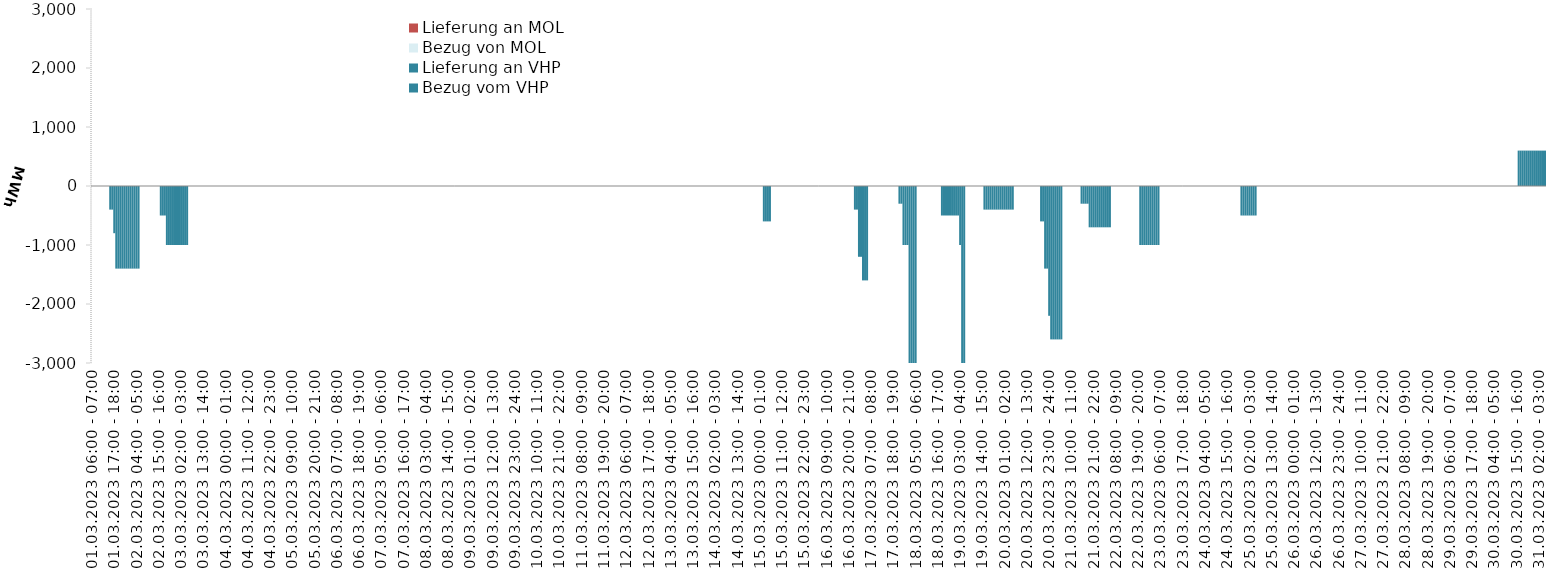
| Category | Bezug vom VHP | Lieferung an VHP | Bezug von MOL | Lieferung an MOL |
|---|---|---|---|---|
| 01.03.2023 06:00 - 07:00 | 0 | 0 | 0 | 0 |
| 01.03.2023 07:00 - 08:00 | 0 | 0 | 0 | 0 |
| 01.03.2023 08:00 - 09:00 | 0 | 0 | 0 | 0 |
| 01.03.2023 09:00 - 10:00 | 0 | 0 | 0 | 0 |
| 01.03.2023 10:00 - 11:00 | 0 | 0 | 0 | 0 |
| 01.03.2023 11:00 - 12:00 | 0 | 0 | 0 | 0 |
| 01.03.2023 12:00 - 13:00 | 0 | 0 | 0 | 0 |
| 01.03.2023 13:00 - 14:00 | 0 | 0 | 0 | 0 |
| 01.03.2023 14:00 - 15:00 | 0 | 0 | 0 | 0 |
| 01.03.2023 15:00 - 16:00 | 0 | -400 | 0 | 0 |
| 01.03.2023 16:00 - 17:00 | 0 | -400 | 0 | 0 |
| 01.03.2023 17:00 - 18:00 | 0 | -800 | 0 | 0 |
| 01.03.2023 18:00 - 19:00 | 0 | -1400 | 0 | 0 |
| 01.03.2023 19:00 - 20:00 | 0 | -1400 | 0 | 0 |
| 01.03.2023 20:00 - 21:00 | 0 | -1400 | 0 | 0 |
| 01.03.2023 21:00 - 22:00 | 0 | -1400 | 0 | 0 |
| 01.03.2023 22:00 - 23:00 | 0 | -1400 | 0 | 0 |
| 01.03.2023 23:00 - 24:00 | 0 | -1400 | 0 | 0 |
| 02.03.2023 00:00 - 01:00 | 0 | -1400 | 0 | 0 |
| 02.03.2023 01:00 - 02:00 | 0 | -1400 | 0 | 0 |
| 02.03.2023 02:00 - 03:00 | 0 | -1400 | 0 | 0 |
| 02.03.2023 03:00 - 04:00 | 0 | -1400 | 0 | 0 |
| 02.03.2023 04:00 - 05:00 | 0 | -1400 | 0 | 0 |
| 02.03.2023 05:00 - 06:00 | 0 | -1400 | 0 | 0 |
| 02.03.2023 06:00 - 07:00 | 0 | 0 | 0 | 0 |
| 02.03.2023 07:00 - 08:00 | 0 | 0 | 0 | 0 |
| 02.03.2023 08:00 - 09:00 | 0 | 0 | 0 | 0 |
| 02.03.2023 09:00 - 10:00 | 0 | 0 | 0 | 0 |
| 02.03.2023 10:00 - 11:00 | 0 | 0 | 0 | 0 |
| 02.03.2023 11:00 - 12:00 | 0 | 0 | 0 | 0 |
| 02.03.2023 12:00 - 13:00 | 0 | 0 | 0 | 0 |
| 02.03.2023 13:00 - 14:00 | 0 | 0 | 0 | 0 |
| 02.03.2023 14:00 - 15:00 | 0 | 0 | 0 | 0 |
| 02.03.2023 15:00 - 16:00 | 0 | 0 | 0 | 0 |
| 02.03.2023 16:00 - 17:00 | 0 | -500 | 0 | 0 |
| 02.03.2023 17:00 - 18:00 | 0 | -500 | 0 | 0 |
| 02.03.2023 18:00 - 19:00 | 0 | -500 | 0 | 0 |
| 02.03.2023 19:00 - 20:00 | 0 | -1000 | 0 | 0 |
| 02.03.2023 20:00 - 21:00 | 0 | -1000 | 0 | 0 |
| 02.03.2023 21:00 - 22:00 | 0 | -1000 | 0 | 0 |
| 02.03.2023 22:00 - 23:00 | 0 | -1000 | 0 | 0 |
| 02.03.2023 23:00 - 24:00 | 0 | -1000 | 0 | 0 |
| 03.03.2023 00:00 - 01:00 | 0 | -1000 | 0 | 0 |
| 03.03.2023 01:00 - 02:00 | 0 | -1000 | 0 | 0 |
| 03.03.2023 02:00 - 03:00 | 0 | -1000 | 0 | 0 |
| 03.03.2023 03:00 - 04:00 | 0 | -1000 | 0 | 0 |
| 03.03.2023 04:00 - 05:00 | 0 | -1000 | 0 | 0 |
| 03.03.2023 05:00 - 06:00 | 0 | -1000 | 0 | 0 |
| 03.03.2023 06:00 - 07:00 | 0 | 0 | 0 | 0 |
| 03.03.2023 07:00 - 08:00 | 0 | 0 | 0 | 0 |
| 03.03.2023 08:00 - 09:00 | 0 | 0 | 0 | 0 |
| 03.03.2023 09:00 - 10:00 | 0 | 0 | 0 | 0 |
| 03.03.2023 10:00 - 11:00 | 0 | 0 | 0 | 0 |
| 03.03.2023 11:00 - 12:00 | 0 | 0 | 0 | 0 |
| 03.03.2023 12:00 - 13:00 | 0 | 0 | 0 | 0 |
| 03.03.2023 13:00 - 14:00 | 0 | 0 | 0 | 0 |
| 03.03.2023 14:00 - 15:00 | 0 | 0 | 0 | 0 |
| 03.03.2023 15:00 - 16:00 | 0 | 0 | 0 | 0 |
| 03.03.2023 16:00 - 17:00 | 0 | 0 | 0 | 0 |
| 03.03.2023 17:00 - 18:00 | 0 | 0 | 0 | 0 |
| 03.03.2023 18:00 - 19:00 | 0 | 0 | 0 | 0 |
| 03.03.2023 19:00 - 20:00 | 0 | 0 | 0 | 0 |
| 03.03.2023 20:00 - 21:00 | 0 | 0 | 0 | 0 |
| 03.03.2023 21:00 - 22:00 | 0 | 0 | 0 | 0 |
| 03.03.2023 22:00 - 23:00 | 0 | 0 | 0 | 0 |
| 03.03.2023 23:00 - 24:00 | 0 | 0 | 0 | 0 |
| 04.03.2023 00:00 - 01:00 | 0 | 0 | 0 | 0 |
| 04.03.2023 01:00 - 02:00 | 0 | 0 | 0 | 0 |
| 04.03.2023 02:00 - 03:00 | 0 | 0 | 0 | 0 |
| 04.03.2023 03:00 - 04:00 | 0 | 0 | 0 | 0 |
| 04.03.2023 04:00 - 05:00 | 0 | 0 | 0 | 0 |
| 04.03.2023 05:00 - 06:00 | 0 | 0 | 0 | 0 |
| 04.03.2023 06:00 - 07:00 | 0 | 0 | 0 | 0 |
| 04.03.2023 07:00 - 08:00 | 0 | 0 | 0 | 0 |
| 04.03.2023 08:00 - 09:00 | 0 | 0 | 0 | 0 |
| 04.03.2023 09:00 - 10:00 | 0 | 0 | 0 | 0 |
| 04.03.2023 10:00 - 11:00 | 0 | 0 | 0 | 0 |
| 04.03.2023 11:00 - 12:00 | 0 | 0 | 0 | 0 |
| 04.03.2023 12:00 - 13:00 | 0 | 0 | 0 | 0 |
| 04.03.2023 13:00 - 14:00 | 0 | 0 | 0 | 0 |
| 04.03.2023 14:00 - 15:00 | 0 | 0 | 0 | 0 |
| 04.03.2023 15:00 - 16:00 | 0 | 0 | 0 | 0 |
| 04.03.2023 16:00 - 17:00 | 0 | 0 | 0 | 0 |
| 04.03.2023 17:00 - 18:00 | 0 | 0 | 0 | 0 |
| 04.03.2023 18:00 - 19:00 | 0 | 0 | 0 | 0 |
| 04.03.2023 19:00 - 20:00 | 0 | 0 | 0 | 0 |
| 04.03.2023 20:00 - 21:00 | 0 | 0 | 0 | 0 |
| 04.03.2023 21:00 - 22:00 | 0 | 0 | 0 | 0 |
| 04.03.2023 22:00 - 23:00 | 0 | 0 | 0 | 0 |
| 04.03.2023 23:00 - 24:00 | 0 | 0 | 0 | 0 |
| 05.03.2023 00:00 - 01:00 | 0 | 0 | 0 | 0 |
| 05.03.2023 01:00 - 02:00 | 0 | 0 | 0 | 0 |
| 05.03.2023 02:00 - 03:00 | 0 | 0 | 0 | 0 |
| 05.03.2023 03:00 - 04:00 | 0 | 0 | 0 | 0 |
| 05.03.2023 04:00 - 05:00 | 0 | 0 | 0 | 0 |
| 05.03.2023 05:00 - 06:00 | 0 | 0 | 0 | 0 |
| 05.03.2023 06:00 - 07:00 | 0 | 0 | 0 | 0 |
| 05.03.2023 07:00 - 08:00 | 0 | 0 | 0 | 0 |
| 05.03.2023 08:00 - 09:00 | 0 | 0 | 0 | 0 |
| 05.03.2023 09:00 - 10:00 | 0 | 0 | 0 | 0 |
| 05.03.2023 10:00 - 11:00 | 0 | 0 | 0 | 0 |
| 05.03.2023 11:00 - 12:00 | 0 | 0 | 0 | 0 |
| 05.03.2023 12:00 - 13:00 | 0 | 0 | 0 | 0 |
| 05.03.2023 13:00 - 14:00 | 0 | 0 | 0 | 0 |
| 05.03.2023 14:00 - 15:00 | 0 | 0 | 0 | 0 |
| 05.03.2023 15:00 - 16:00 | 0 | 0 | 0 | 0 |
| 05.03.2023 16:00 - 17:00 | 0 | 0 | 0 | 0 |
| 05.03.2023 17:00 - 18:00 | 0 | 0 | 0 | 0 |
| 05.03.2023 18:00 - 19:00 | 0 | 0 | 0 | 0 |
| 05.03.2023 19:00 - 20:00 | 0 | 0 | 0 | 0 |
| 05.03.2023 20:00 - 21:00 | 0 | 0 | 0 | 0 |
| 05.03.2023 21:00 - 22:00 | 0 | 0 | 0 | 0 |
| 05.03.2023 22:00 - 23:00 | 0 | 0 | 0 | 0 |
| 05.03.2023 23:00 - 24:00 | 0 | 0 | 0 | 0 |
| 06.03.2023 00:00 - 01:00 | 0 | 0 | 0 | 0 |
| 06.03.2023 01:00 - 02:00 | 0 | 0 | 0 | 0 |
| 06.03.2023 02:00 - 03:00 | 0 | 0 | 0 | 0 |
| 06.03.2023 03:00 - 04:00 | 0 | 0 | 0 | 0 |
| 06.03.2023 04:00 - 05:00 | 0 | 0 | 0 | 0 |
| 06.03.2023 05:00 - 06:00 | 0 | 0 | 0 | 0 |
| 06.03.2023 06:00 - 07:00 | 0 | 0 | 0 | 0 |
| 06.03.2023 07:00 - 08:00 | 0 | 0 | 0 | 0 |
| 06.03.2023 08:00 - 09:00 | 0 | 0 | 0 | 0 |
| 06.03.2023 09:00 - 10:00 | 0 | 0 | 0 | 0 |
| 06.03.2023 10:00 - 11:00 | 0 | 0 | 0 | 0 |
| 06.03.2023 11:00 - 12:00 | 0 | 0 | 0 | 0 |
| 06.03.2023 12:00 - 13:00 | 0 | 0 | 0 | 0 |
| 06.03.2023 13:00 - 14:00 | 0 | 0 | 0 | 0 |
| 06.03.2023 14:00 - 15:00 | 0 | 0 | 0 | 0 |
| 06.03.2023 15:00 - 16:00 | 0 | 0 | 0 | 0 |
| 06.03.2023 16:00 - 17:00 | 0 | 0 | 0 | 0 |
| 06.03.2023 17:00 - 18:00 | 0 | 0 | 0 | 0 |
| 06.03.2023 18:00 - 19:00 | 0 | 0 | 0 | 0 |
| 06.03.2023 19:00 - 20:00 | 0 | 0 | 0 | 0 |
| 06.03.2023 20:00 - 21:00 | 0 | 0 | 0 | 0 |
| 06.03.2023 21:00 - 22:00 | 0 | 0 | 0 | 0 |
| 06.03.2023 22:00 - 23:00 | 0 | 0 | 0 | 0 |
| 06.03.2023 23:00 - 24:00 | 0 | 0 | 0 | 0 |
| 07.03.2023 00:00 - 01:00 | 0 | 0 | 0 | 0 |
| 07.03.2023 01:00 - 02:00 | 0 | 0 | 0 | 0 |
| 07.03.2023 02:00 - 03:00 | 0 | 0 | 0 | 0 |
| 07.03.2023 03:00 - 04:00 | 0 | 0 | 0 | 0 |
| 07.03.2023 04:00 - 05:00 | 0 | 0 | 0 | 0 |
| 07.03.2023 05:00 - 06:00 | 0 | 0 | 0 | 0 |
| 07.03.2023 06:00 - 07:00 | 0 | 0 | 0 | 0 |
| 07.03.2023 07:00 - 08:00 | 0 | 0 | 0 | 0 |
| 07.03.2023 08:00 - 09:00 | 0 | 0 | 0 | 0 |
| 07.03.2023 09:00 - 10:00 | 0 | 0 | 0 | 0 |
| 07.03.2023 10:00 - 11:00 | 0 | 0 | 0 | 0 |
| 07.03.2023 11:00 - 12:00 | 0 | 0 | 0 | 0 |
| 07.03.2023 12:00 - 13:00 | 0 | 0 | 0 | 0 |
| 07.03.2023 13:00 - 14:00 | 0 | 0 | 0 | 0 |
| 07.03.2023 14:00 - 15:00 | 0 | 0 | 0 | 0 |
| 07.03.2023 15:00 - 16:00 | 0 | 0 | 0 | 0 |
| 07.03.2023 16:00 - 17:00 | 0 | 0 | 0 | 0 |
| 07.03.2023 17:00 - 18:00 | 0 | 0 | 0 | 0 |
| 07.03.2023 18:00 - 19:00 | 0 | 0 | 0 | 0 |
| 07.03.2023 19:00 - 20:00 | 0 | 0 | 0 | 0 |
| 07.03.2023 20:00 - 21:00 | 0 | 0 | 0 | 0 |
| 07.03.2023 21:00 - 22:00 | 0 | 0 | 0 | 0 |
| 07.03.2023 22:00 - 23:00 | 0 | 0 | 0 | 0 |
| 07.03.2023 23:00 - 24:00 | 0 | 0 | 0 | 0 |
| 08.03.2023 00:00 - 01:00 | 0 | 0 | 0 | 0 |
| 08.03.2023 01:00 - 02:00 | 0 | 0 | 0 | 0 |
| 08.03.2023 02:00 - 03:00 | 0 | 0 | 0 | 0 |
| 08.03.2023 03:00 - 04:00 | 0 | 0 | 0 | 0 |
| 08.03.2023 04:00 - 05:00 | 0 | 0 | 0 | 0 |
| 08.03.2023 05:00 - 06:00 | 0 | 0 | 0 | 0 |
| 08.03.2023 06:00 - 07:00 | 0 | 0 | 0 | 0 |
| 08.03.2023 07:00 - 08:00 | 0 | 0 | 0 | 0 |
| 08.03.2023 08:00 - 09:00 | 0 | 0 | 0 | 0 |
| 08.03.2023 09:00 - 10:00 | 0 | 0 | 0 | 0 |
| 08.03.2023 10:00 - 11:00 | 0 | 0 | 0 | 0 |
| 08.03.2023 11:00 - 12:00 | 0 | 0 | 0 | 0 |
| 08.03.2023 12:00 - 13:00 | 0 | 0 | 0 | 0 |
| 08.03.2023 13:00 - 14:00 | 0 | 0 | 0 | 0 |
| 08.03.2023 14:00 - 15:00 | 0 | 0 | 0 | 0 |
| 08.03.2023 15:00 - 16:00 | 0 | 0 | 0 | 0 |
| 08.03.2023 16:00 - 17:00 | 0 | 0 | 0 | 0 |
| 08.03.2023 17:00 - 18:00 | 0 | 0 | 0 | 0 |
| 08.03.2023 18:00 - 19:00 | 0 | 0 | 0 | 0 |
| 08.03.2023 19:00 - 20:00 | 0 | 0 | 0 | 0 |
| 08.03.2023 20:00 - 21:00 | 0 | 0 | 0 | 0 |
| 08.03.2023 21:00 - 22:00 | 0 | 0 | 0 | 0 |
| 08.03.2023 22:00 - 23:00 | 0 | 0 | 0 | 0 |
| 08.03.2023 23:00 - 24:00 | 0 | 0 | 0 | 0 |
| 09.03.2023 00:00 - 01:00 | 0 | 0 | 0 | 0 |
| 09.03.2023 01:00 - 02:00 | 0 | 0 | 0 | 0 |
| 09.03.2023 02:00 - 03:00 | 0 | 0 | 0 | 0 |
| 09.03.2023 03:00 - 04:00 | 0 | 0 | 0 | 0 |
| 09.03.2023 04:00 - 05:00 | 0 | 0 | 0 | 0 |
| 09.03.2023 05:00 - 06:00 | 0 | 0 | 0 | 0 |
| 09.03.2023 06:00 - 07:00 | 0 | 0 | 0 | 0 |
| 09.03.2023 07:00 - 08:00 | 0 | 0 | 0 | 0 |
| 09.03.2023 08:00 - 09:00 | 0 | 0 | 0 | 0 |
| 09.03.2023 09:00 - 10:00 | 0 | 0 | 0 | 0 |
| 09.03.2023 10:00 - 11:00 | 0 | 0 | 0 | 0 |
| 09.03.2023 11:00 - 12:00 | 0 | 0 | 0 | 0 |
| 09.03.2023 12:00 - 13:00 | 0 | 0 | 0 | 0 |
| 09.03.2023 13:00 - 14:00 | 0 | 0 | 0 | 0 |
| 09.03.2023 14:00 - 15:00 | 0 | 0 | 0 | 0 |
| 09.03.2023 15:00 - 16:00 | 0 | 0 | 0 | 0 |
| 09.03.2023 16:00 - 17:00 | 0 | 0 | 0 | 0 |
| 09.03.2023 17:00 - 18:00 | 0 | 0 | 0 | 0 |
| 09.03.2023 18:00 - 19:00 | 0 | 0 | 0 | 0 |
| 09.03.2023 19:00 - 20:00 | 0 | 0 | 0 | 0 |
| 09.03.2023 20:00 - 21:00 | 0 | 0 | 0 | 0 |
| 09.03.2023 21:00 - 22:00 | 0 | 0 | 0 | 0 |
| 09.03.2023 22:00 - 23:00 | 0 | 0 | 0 | 0 |
| 09.03.2023 23:00 - 24:00 | 0 | 0 | 0 | 0 |
| 10.03.2023 00:00 - 01:00 | 0 | 0 | 0 | 0 |
| 10.03.2023 01:00 - 02:00 | 0 | 0 | 0 | 0 |
| 10.03.2023 02:00 - 03:00 | 0 | 0 | 0 | 0 |
| 10.03.2023 03:00 - 04:00 | 0 | 0 | 0 | 0 |
| 10.03.2023 04:00 - 05:00 | 0 | 0 | 0 | 0 |
| 10.03.2023 05:00 - 06:00 | 0 | 0 | 0 | 0 |
| 10.03.2023 06:00 - 07:00 | 0 | 0 | 0 | 0 |
| 10.03.2023 07:00 - 08:00 | 0 | 0 | 0 | 0 |
| 10.03.2023 08:00 - 09:00 | 0 | 0 | 0 | 0 |
| 10.03.2023 09:00 - 10:00 | 0 | 0 | 0 | 0 |
| 10.03.2023 10:00 - 11:00 | 0 | 0 | 0 | 0 |
| 10.03.2023 11:00 - 12:00 | 0 | 0 | 0 | 0 |
| 10.03.2023 12:00 - 13:00 | 0 | 0 | 0 | 0 |
| 10.03.2023 13:00 - 14:00 | 0 | 0 | 0 | 0 |
| 10.03.2023 14:00 - 15:00 | 0 | 0 | 0 | 0 |
| 10.03.2023 15:00 - 16:00 | 0 | 0 | 0 | 0 |
| 10.03.2023 16:00 - 17:00 | 0 | 0 | 0 | 0 |
| 10.03.2023 17:00 - 18:00 | 0 | 0 | 0 | 0 |
| 10.03.2023 18:00 - 19:00 | 0 | 0 | 0 | 0 |
| 10.03.2023 19:00 - 20:00 | 0 | 0 | 0 | 0 |
| 10.03.2023 20:00 - 21:00 | 0 | 0 | 0 | 0 |
| 10.03.2023 21:00 - 22:00 | 0 | 0 | 0 | 0 |
| 10.03.2023 22:00 - 23:00 | 0 | 0 | 0 | 0 |
| 10.03.2023 23:00 - 24:00 | 0 | 0 | 0 | 0 |
| 11.03.2023 00:00 - 01:00 | 0 | 0 | 0 | 0 |
| 11.03.2023 01:00 - 02:00 | 0 | 0 | 0 | 0 |
| 11.03.2023 02:00 - 03:00 | 0 | 0 | 0 | 0 |
| 11.03.2023 03:00 - 04:00 | 0 | 0 | 0 | 0 |
| 11.03.2023 04:00 - 05:00 | 0 | 0 | 0 | 0 |
| 11.03.2023 05:00 - 06:00 | 0 | 0 | 0 | 0 |
| 11.03.2023 06:00 - 07:00 | 0 | 0 | 0 | 0 |
| 11.03.2023 07:00 - 08:00 | 0 | 0 | 0 | 0 |
| 11.03.2023 08:00 - 09:00 | 0 | 0 | 0 | 0 |
| 11.03.2023 09:00 - 10:00 | 0 | 0 | 0 | 0 |
| 11.03.2023 10:00 - 11:00 | 0 | 0 | 0 | 0 |
| 11.03.2023 11:00 - 12:00 | 0 | 0 | 0 | 0 |
| 11.03.2023 12:00 - 13:00 | 0 | 0 | 0 | 0 |
| 11.03.2023 13:00 - 14:00 | 0 | 0 | 0 | 0 |
| 11.03.2023 14:00 - 15:00 | 0 | 0 | 0 | 0 |
| 11.03.2023 15:00 - 16:00 | 0 | 0 | 0 | 0 |
| 11.03.2023 16:00 - 17:00 | 0 | 0 | 0 | 0 |
| 11.03.2023 17:00 - 18:00 | 0 | 0 | 0 | 0 |
| 11.03.2023 18:00 - 19:00 | 0 | 0 | 0 | 0 |
| 11.03.2023 19:00 - 20:00 | 0 | 0 | 0 | 0 |
| 11.03.2023 20:00 - 21:00 | 0 | 0 | 0 | 0 |
| 11.03.2023 21:00 - 22:00 | 0 | 0 | 0 | 0 |
| 11.03.2023 22:00 - 23:00 | 0 | 0 | 0 | 0 |
| 11.03.2023 23:00 - 24:00 | 0 | 0 | 0 | 0 |
| 12.03.2023 00:00 - 01:00 | 0 | 0 | 0 | 0 |
| 12.03.2023 01:00 - 02:00 | 0 | 0 | 0 | 0 |
| 12.03.2023 02:00 - 03:00 | 0 | 0 | 0 | 0 |
| 12.03.2023 03:00 - 04:00 | 0 | 0 | 0 | 0 |
| 12.03.2023 04:00 - 05:00 | 0 | 0 | 0 | 0 |
| 12.03.2023 05:00 - 06:00 | 0 | 0 | 0 | 0 |
| 12.03.2023 06:00 - 07:00 | 0 | 0 | 0 | 0 |
| 12.03.2023 07:00 - 08:00 | 0 | 0 | 0 | 0 |
| 12.03.2023 08:00 - 09:00 | 0 | 0 | 0 | 0 |
| 12.03.2023 09:00 - 10:00 | 0 | 0 | 0 | 0 |
| 12.03.2023 10:00 - 11:00 | 0 | 0 | 0 | 0 |
| 12.03.2023 11:00 - 12:00 | 0 | 0 | 0 | 0 |
| 12.03.2023 12:00 - 13:00 | 0 | 0 | 0 | 0 |
| 12.03.2023 13:00 - 14:00 | 0 | 0 | 0 | 0 |
| 12.03.2023 14:00 - 15:00 | 0 | 0 | 0 | 0 |
| 12.03.2023 15:00 - 16:00 | 0 | 0 | 0 | 0 |
| 12.03.2023 16:00 - 17:00 | 0 | 0 | 0 | 0 |
| 12.03.2023 17:00 - 18:00 | 0 | 0 | 0 | 0 |
| 12.03.2023 18:00 - 19:00 | 0 | 0 | 0 | 0 |
| 12.03.2023 19:00 - 20:00 | 0 | 0 | 0 | 0 |
| 12.03.2023 20:00 - 21:00 | 0 | 0 | 0 | 0 |
| 12.03.2023 21:00 - 22:00 | 0 | 0 | 0 | 0 |
| 12.03.2023 22:00 - 23:00 | 0 | 0 | 0 | 0 |
| 12.03.2023 23:00 - 24:00 | 0 | 0 | 0 | 0 |
| 13.03.2023 00:00 - 01:00 | 0 | 0 | 0 | 0 |
| 13.03.2023 01:00 - 02:00 | 0 | 0 | 0 | 0 |
| 13.03.2023 02:00 - 03:00 | 0 | 0 | 0 | 0 |
| 13.03.2023 03:00 - 04:00 | 0 | 0 | 0 | 0 |
| 13.03.2023 04:00 - 05:00 | 0 | 0 | 0 | 0 |
| 13.03.2023 05:00 - 06:00 | 0 | 0 | 0 | 0 |
| 13.03.2023 06:00 - 07:00 | 0 | 0 | 0 | 0 |
| 13.03.2023 07:00 - 08:00 | 0 | 0 | 0 | 0 |
| 13.03.2023 08:00 - 09:00 | 0 | 0 | 0 | 0 |
| 13.03.2023 09:00 - 10:00 | 0 | 0 | 0 | 0 |
| 13.03.2023 10:00 - 11:00 | 0 | 0 | 0 | 0 |
| 13.03.2023 11:00 - 12:00 | 0 | 0 | 0 | 0 |
| 13.03.2023 12:00 - 13:00 | 0 | 0 | 0 | 0 |
| 13.03.2023 13:00 - 14:00 | 0 | 0 | 0 | 0 |
| 13.03.2023 14:00 - 15:00 | 0 | 0 | 0 | 0 |
| 13.03.2023 15:00 - 16:00 | 0 | 0 | 0 | 0 |
| 13.03.2023 16:00 - 17:00 | 0 | 0 | 0 | 0 |
| 13.03.2023 17:00 - 18:00 | 0 | 0 | 0 | 0 |
| 13.03.2023 18:00 - 19:00 | 0 | 0 | 0 | 0 |
| 13.03.2023 19:00 - 20:00 | 0 | 0 | 0 | 0 |
| 13.03.2023 20:00 - 21:00 | 0 | 0 | 0 | 0 |
| 13.03.2023 21:00 - 22:00 | 0 | 0 | 0 | 0 |
| 13.03.2023 22:00 - 23:00 | 0 | 0 | 0 | 0 |
| 13.03.2023 23:00 - 24:00 | 0 | 0 | 0 | 0 |
| 14.03.2023 00:00 - 01:00 | 0 | 0 | 0 | 0 |
| 14.03.2023 01:00 - 02:00 | 0 | 0 | 0 | 0 |
| 14.03.2023 02:00 - 03:00 | 0 | 0 | 0 | 0 |
| 14.03.2023 03:00 - 04:00 | 0 | 0 | 0 | 0 |
| 14.03.2023 04:00 - 05:00 | 0 | 0 | 0 | 0 |
| 14.03.2023 05:00 - 06:00 | 0 | 0 | 0 | 0 |
| 14.03.2023 06:00 - 07:00 | 0 | 0 | 0 | 0 |
| 14.03.2023 07:00 - 08:00 | 0 | 0 | 0 | 0 |
| 14.03.2023 08:00 - 09:00 | 0 | 0 | 0 | 0 |
| 14.03.2023 09:00 - 10:00 | 0 | 0 | 0 | 0 |
| 14.03.2023 10:00 - 11:00 | 0 | 0 | 0 | 0 |
| 14.03.2023 11:00 - 12:00 | 0 | 0 | 0 | 0 |
| 14.03.2023 12:00 - 13:00 | 0 | 0 | 0 | 0 |
| 14.03.2023 13:00 - 14:00 | 0 | 0 | 0 | 0 |
| 14.03.2023 14:00 - 15:00 | 0 | 0 | 0 | 0 |
| 14.03.2023 15:00 - 16:00 | 0 | 0 | 0 | 0 |
| 14.03.2023 16:00 - 17:00 | 0 | 0 | 0 | 0 |
| 14.03.2023 17:00 - 18:00 | 0 | 0 | 0 | 0 |
| 14.03.2023 18:00 - 19:00 | 0 | 0 | 0 | 0 |
| 14.03.2023 19:00 - 20:00 | 0 | 0 | 0 | 0 |
| 14.03.2023 20:00 - 21:00 | 0 | 0 | 0 | 0 |
| 14.03.2023 21:00 - 22:00 | 0 | 0 | 0 | 0 |
| 14.03.2023 22:00 - 23:00 | 0 | 0 | 0 | 0 |
| 14.03.2023 23:00 - 24:00 | 0 | 0 | 0 | 0 |
| 15.03.2023 00:00 - 01:00 | 0 | 0 | 0 | 0 |
| 15.03.2023 01:00 - 02:00 | 0 | 0 | 0 | 0 |
| 15.03.2023 02:00 - 03:00 | 0 | -600 | 0 | 0 |
| 15.03.2023 03:00 - 04:00 | 0 | -600 | 0 | 0 |
| 15.03.2023 04:00 - 05:00 | 0 | -600 | 0 | 0 |
| 15.03.2023 05:00 - 06:00 | 0 | -600 | 0 | 0 |
| 15.03.2023 06:00 - 07:00 | 0 | 0 | 0 | 0 |
| 15.03.2023 07:00 - 08:00 | 0 | 0 | 0 | 0 |
| 15.03.2023 08:00 - 09:00 | 0 | 0 | 0 | 0 |
| 15.03.2023 09:00 - 10:00 | 0 | 0 | 0 | 0 |
| 15.03.2023 10:00 - 11:00 | 0 | 0 | 0 | 0 |
| 15.03.2023 11:00 - 12:00 | 0 | 0 | 0 | 0 |
| 15.03.2023 12:00 - 13:00 | 0 | 0 | 0 | 0 |
| 15.03.2023 13:00 - 14:00 | 0 | 0 | 0 | 0 |
| 15.03.2023 14:00 - 15:00 | 0 | 0 | 0 | 0 |
| 15.03.2023 15:00 - 16:00 | 0 | 0 | 0 | 0 |
| 15.03.2023 16:00 - 17:00 | 0 | 0 | 0 | 0 |
| 15.03.2023 17:00 - 18:00 | 0 | 0 | 0 | 0 |
| 15.03.2023 18:00 - 19:00 | 0 | 0 | 0 | 0 |
| 15.03.2023 19:00 - 20:00 | 0 | 0 | 0 | 0 |
| 15.03.2023 20:00 - 21:00 | 0 | 0 | 0 | 0 |
| 15.03.2023 21:00 - 22:00 | 0 | 0 | 0 | 0 |
| 15.03.2023 22:00 - 23:00 | 0 | 0 | 0 | 0 |
| 15.03.2023 23:00 - 24:00 | 0 | 0 | 0 | 0 |
| 16.03.2023 00:00 - 01:00 | 0 | 0 | 0 | 0 |
| 16.03.2023 01:00 - 02:00 | 0 | 0 | 0 | 0 |
| 16.03.2023 02:00 - 03:00 | 0 | 0 | 0 | 0 |
| 16.03.2023 03:00 - 04:00 | 0 | 0 | 0 | 0 |
| 16.03.2023 04:00 - 05:00 | 0 | 0 | 0 | 0 |
| 16.03.2023 05:00 - 06:00 | 0 | 0 | 0 | 0 |
| 16.03.2023 06:00 - 07:00 | 0 | 0 | 0 | 0 |
| 16.03.2023 07:00 - 08:00 | 0 | 0 | 0 | 0 |
| 16.03.2023 08:00 - 09:00 | 0 | 0 | 0 | 0 |
| 16.03.2023 09:00 - 10:00 | 0 | 0 | 0 | 0 |
| 16.03.2023 10:00 - 11:00 | 0 | 0 | 0 | 0 |
| 16.03.2023 11:00 - 12:00 | 0 | 0 | 0 | 0 |
| 16.03.2023 12:00 - 13:00 | 0 | 0 | 0 | 0 |
| 16.03.2023 13:00 - 14:00 | 0 | 0 | 0 | 0 |
| 16.03.2023 14:00 - 15:00 | 0 | 0 | 0 | 0 |
| 16.03.2023 15:00 - 16:00 | 0 | 0 | 0 | 0 |
| 16.03.2023 16:00 - 17:00 | 0 | 0 | 0 | 0 |
| 16.03.2023 17:00 - 18:00 | 0 | 0 | 0 | 0 |
| 16.03.2023 18:00 - 19:00 | 0 | 0 | 0 | 0 |
| 16.03.2023 19:00 - 20:00 | 0 | 0 | 0 | 0 |
| 16.03.2023 20:00 - 21:00 | 0 | 0 | 0 | 0 |
| 16.03.2023 21:00 - 22:00 | 0 | 0 | 0 | 0 |
| 16.03.2023 22:00 - 23:00 | 0 | 0 | 0 | 0 |
| 16.03.2023 23:00 - 24:00 | 0 | -400 | 0 | 0 |
| 17.03.2023 00:00 - 01:00 | 0 | -400 | 0 | 0 |
| 17.03.2023 01:00 - 02:00 | 0 | -1200 | 0 | 0 |
| 17.03.2023 02:00 - 03:00 | 0 | -1200 | 0 | 0 |
| 17.03.2023 03:00 - 04:00 | 0 | -1600 | 0 | 0 |
| 17.03.2023 04:00 - 05:00 | 0 | -1600 | 0 | 0 |
| 17.03.2023 05:00 - 06:00 | 0 | -1600 | 0 | 0 |
| 17.03.2023 06:00 - 07:00 | 0 | 0 | 0 | 0 |
| 17.03.2023 07:00 - 08:00 | 0 | 0 | 0 | 0 |
| 17.03.2023 08:00 - 09:00 | 0 | 0 | 0 | 0 |
| 17.03.2023 09:00 - 10:00 | 0 | 0 | 0 | 0 |
| 17.03.2023 10:00 - 11:00 | 0 | 0 | 0 | 0 |
| 17.03.2023 11:00 - 12:00 | 0 | 0 | 0 | 0 |
| 17.03.2023 12:00 - 13:00 | 0 | 0 | 0 | 0 |
| 17.03.2023 13:00 - 14:00 | 0 | 0 | 0 | 0 |
| 17.03.2023 14:00 - 15:00 | 0 | 0 | 0 | 0 |
| 17.03.2023 15:00 - 16:00 | 0 | 0 | 0 | 0 |
| 17.03.2023 16:00 - 17:00 | 0 | 0 | 0 | 0 |
| 17.03.2023 17:00 - 18:00 | 0 | 0 | 0 | 0 |
| 17.03.2023 18:00 - 19:00 | 0 | 0 | 0 | 0 |
| 17.03.2023 19:00 - 20:00 | 0 | 0 | 0 | 0 |
| 17.03.2023 20:00 - 21:00 | 0 | 0 | 0 | 0 |
| 17.03.2023 21:00 - 22:00 | 0 | -300 | 0 | 0 |
| 17.03.2023 22:00 - 23:00 | 0 | -300 | 0 | 0 |
| 17.03.2023 23:00 - 24:00 | 0 | -1000 | 0 | 0 |
| 18.03.2023 00:00 - 01:00 | 0 | -1000 | 0 | 0 |
| 18.03.2023 01:00 - 02:00 | 0 | -1000 | 0 | 0 |
| 18.03.2023 02:00 - 03:00 | 0 | -3000 | 0 | 0 |
| 18.03.2023 03:00 - 04:00 | 0 | -3000 | 0 | 0 |
| 18.03.2023 04:00 - 05:00 | 0 | -3000 | 0 | 0 |
| 18.03.2023 05:00 - 06:00 | 0 | -3000 | 0 | 0 |
| 18.03.2023 06:00 - 07:00 | 0 | 0 | 0 | 0 |
| 18.03.2023 07:00 - 08:00 | 0 | 0 | 0 | 0 |
| 18.03.2023 08:00 - 09:00 | 0 | 0 | 0 | 0 |
| 18.03.2023 09:00 - 10:00 | 0 | 0 | 0 | 0 |
| 18.03.2023 10:00 - 11:00 | 0 | 0 | 0 | 0 |
| 18.03.2023 11:00 - 12:00 | 0 | 0 | 0 | 0 |
| 18.03.2023 12:00 - 13:00 | 0 | 0 | 0 | 0 |
| 18.03.2023 13:00 - 14:00 | 0 | 0 | 0 | 0 |
| 18.03.2023 14:00 - 15:00 | 0 | 0 | 0 | 0 |
| 18.03.2023 15:00 - 16:00 | 0 | 0 | 0 | 0 |
| 18.03.2023 16:00 - 17:00 | 0 | 0 | 0 | 0 |
| 18.03.2023 17:00 - 18:00 | 0 | 0 | 0 | 0 |
| 18.03.2023 18:00 - 19:00 | 0 | -500 | 0 | 0 |
| 18.03.2023 19:00 - 20:00 | 0 | -500 | 0 | 0 |
| 18.03.2023 20:00 - 21:00 | 0 | -500 | 0 | 0 |
| 18.03.2023 21:00 - 22:00 | 0 | -500 | 0 | 0 |
| 18.03.2023 22:00 - 23:00 | 0 | -500 | 0 | 0 |
| 18.03.2023 23:00 - 24:00 | 0 | -500 | 0 | 0 |
| 19.03.2023 00:00 - 01:00 | 0 | -500 | 0 | 0 |
| 19.03.2023 01:00 - 02:00 | 0 | -500 | 0 | 0 |
| 19.03.2023 02:00 - 03:00 | 0 | -500 | 0 | 0 |
| 19.03.2023 03:00 - 04:00 | 0 | -1000 | 0 | 0 |
| 19.03.2023 04:00 - 05:00 | 0 | -3000 | 0 | 0 |
| 19.03.2023 05:00 - 06:00 | 0 | -3000 | 0 | 0 |
| 19.03.2023 06:00 - 07:00 | 0 | 0 | 0 | 0 |
| 19.03.2023 07:00 - 08:00 | 0 | 0 | 0 | 0 |
| 19.03.2023 08:00 - 09:00 | 0 | 0 | 0 | 0 |
| 19.03.2023 09:00 - 10:00 | 0 | 0 | 0 | 0 |
| 19.03.2023 10:00 - 11:00 | 0 | 0 | 0 | 0 |
| 19.03.2023 11:00 - 12:00 | 0 | 0 | 0 | 0 |
| 19.03.2023 12:00 - 13:00 | 0 | 0 | 0 | 0 |
| 19.03.2023 13:00 - 14:00 | 0 | 0 | 0 | 0 |
| 19.03.2023 14:00 - 15:00 | 0 | 0 | 0 | 0 |
| 19.03.2023 15:00 - 16:00 | 0 | -400 | 0 | 0 |
| 19.03.2023 16:00 - 17:00 | 0 | -400 | 0 | 0 |
| 19.03.2023 17:00 - 18:00 | 0 | -400 | 0 | 0 |
| 19.03.2023 18:00 - 19:00 | 0 | -400 | 0 | 0 |
| 19.03.2023 19:00 - 20:00 | 0 | -400 | 0 | 0 |
| 19.03.2023 20:00 - 21:00 | 0 | -400 | 0 | 0 |
| 19.03.2023 21:00 - 22:00 | 0 | -400 | 0 | 0 |
| 19.03.2023 22:00 - 23:00 | 0 | -400 | 0 | 0 |
| 19.03.2023 23:00 - 24:00 | 0 | -400 | 0 | 0 |
| 20.03.2023 00:00 - 01:00 | 0 | -400 | 0 | 0 |
| 20.03.2023 01:00 - 02:00 | 0 | -400 | 0 | 0 |
| 20.03.2023 02:00 - 03:00 | 0 | -400 | 0 | 0 |
| 20.03.2023 03:00 - 04:00 | 0 | -400 | 0 | 0 |
| 20.03.2023 04:00 - 05:00 | 0 | -400 | 0 | 0 |
| 20.03.2023 05:00 - 06:00 | 0 | -400 | 0 | 0 |
| 20.03.2023 06:00 - 07:00 | 0 | 0 | 0 | 0 |
| 20.03.2023 07:00 - 08:00 | 0 | 0 | 0 | 0 |
| 20.03.2023 08:00 - 09:00 | 0 | 0 | 0 | 0 |
| 20.03.2023 09:00 - 10:00 | 0 | 0 | 0 | 0 |
| 20.03.2023 10:00 - 11:00 | 0 | 0 | 0 | 0 |
| 20.03.2023 11:00 - 12:00 | 0 | 0 | 0 | 0 |
| 20.03.2023 12:00 - 13:00 | 0 | 0 | 0 | 0 |
| 20.03.2023 13:00 - 14:00 | 0 | 0 | 0 | 0 |
| 20.03.2023 14:00 - 15:00 | 0 | 0 | 0 | 0 |
| 20.03.2023 15:00 - 16:00 | 0 | 0 | 0 | 0 |
| 20.03.2023 16:00 - 17:00 | 0 | 0 | 0 | 0 |
| 20.03.2023 17:00 - 18:00 | 0 | 0 | 0 | 0 |
| 20.03.2023 18:00 - 19:00 | 0 | 0 | 0 | 0 |
| 20.03.2023 19:00 - 20:00 | 0 | -600 | 0 | 0 |
| 20.03.2023 20:00 - 21:00 | 0 | -600 | 0 | 0 |
| 20.03.2023 21:00 - 22:00 | 0 | -1400 | 0 | 0 |
| 20.03.2023 22:00 - 23:00 | 0 | -1400 | 0 | 0 |
| 20.03.2023 23:00 - 24:00 | 0 | -2200 | 0 | 0 |
| 21.03.2023 00:00 - 01:00 | 0 | -2600 | 0 | 0 |
| 21.03.2023 01:00 - 02:00 | 0 | -2600 | 0 | 0 |
| 21.03.2023 02:00 - 03:00 | 0 | -2600 | 0 | 0 |
| 21.03.2023 03:00 - 04:00 | 0 | -2600 | 0 | 0 |
| 21.03.2023 04:00 - 05:00 | 0 | -2600 | 0 | 0 |
| 21.03.2023 05:00 - 06:00 | 0 | -2600 | 0 | 0 |
| 21.03.2023 06:00 - 07:00 | 0 | 0 | 0 | 0 |
| 21.03.2023 07:00 - 08:00 | 0 | 0 | 0 | 0 |
| 21.03.2023 08:00 - 09:00 | 0 | 0 | 0 | 0 |
| 21.03.2023 09:00 - 10:00 | 0 | 0 | 0 | 0 |
| 21.03.2023 10:00 - 11:00 | 0 | 0 | 0 | 0 |
| 21.03.2023 11:00 - 12:00 | 0 | 0 | 0 | 0 |
| 21.03.2023 12:00 - 13:00 | 0 | 0 | 0 | 0 |
| 21.03.2023 13:00 - 14:00 | 0 | 0 | 0 | 0 |
| 21.03.2023 14:00 - 15:00 | 0 | 0 | 0 | 0 |
| 21.03.2023 15:00 - 16:00 | 0 | -300 | 0 | 0 |
| 21.03.2023 16:00 - 17:00 | 0 | -300 | 0 | 0 |
| 21.03.2023 17:00 - 18:00 | 0 | -300 | 0 | 0 |
| 21.03.2023 18:00 - 19:00 | 0 | -300 | 0 | 0 |
| 21.03.2023 19:00 - 20:00 | 0 | -700 | 0 | 0 |
| 21.03.2023 20:00 - 21:00 | 0 | -700 | 0 | 0 |
| 21.03.2023 21:00 - 22:00 | 0 | -700 | 0 | 0 |
| 21.03.2023 22:00 - 23:00 | 0 | -700 | 0 | 0 |
| 21.03.2023 23:00 - 24:00 | 0 | -700 | 0 | 0 |
| 22.03.2023 00:00 - 01:00 | 0 | -700 | 0 | 0 |
| 22.03.2023 01:00 - 02:00 | 0 | -700 | 0 | 0 |
| 22.03.2023 02:00 - 03:00 | 0 | -700 | 0 | 0 |
| 22.03.2023 03:00 - 04:00 | 0 | -700 | 0 | 0 |
| 22.03.2023 04:00 - 05:00 | 0 | -700 | 0 | 0 |
| 22.03.2023 05:00 - 06:00 | 0 | -700 | 0 | 0 |
| 22.03.2023 06:00 - 07:00 | 0 | 0 | 0 | 0 |
| 22.03.2023 07:00 - 08:00 | 0 | 0 | 0 | 0 |
| 22.03.2023 08:00 - 09:00 | 0 | 0 | 0 | 0 |
| 22.03.2023 09:00 - 10:00 | 0 | 0 | 0 | 0 |
| 22.03.2023 10:00 - 11:00 | 0 | 0 | 0 | 0 |
| 22.03.2023 11:00 - 12:00 | 0 | 0 | 0 | 0 |
| 22.03.2023 12:00 - 13:00 | 0 | 0 | 0 | 0 |
| 22.03.2023 13:00 - 14:00 | 0 | 0 | 0 | 0 |
| 22.03.2023 14:00 - 15:00 | 0 | 0 | 0 | 0 |
| 22.03.2023 15:00 - 16:00 | 0 | 0 | 0 | 0 |
| 22.03.2023 16:00 - 17:00 | 0 | 0 | 0 | 0 |
| 22.03.2023 17:00 - 18:00 | 0 | 0 | 0 | 0 |
| 22.03.2023 18:00 - 19:00 | 0 | 0 | 0 | 0 |
| 22.03.2023 19:00 - 20:00 | 0 | 0 | 0 | 0 |
| 22.03.2023 20:00 - 21:00 | 0 | -1000 | 0 | 0 |
| 22.03.2023 21:00 - 22:00 | 0 | -1000 | 0 | 0 |
| 22.03.2023 22:00 - 23:00 | 0 | -1000 | 0 | 0 |
| 22.03.2023 23:00 - 24:00 | 0 | -1000 | 0 | 0 |
| 23.03.2023 00:00 - 01:00 | 0 | -1000 | 0 | 0 |
| 23.03.2023 01:00 - 02:00 | 0 | -1000 | 0 | 0 |
| 23.03.2023 02:00 - 03:00 | 0 | -1000 | 0 | 0 |
| 23.03.2023 03:00 - 04:00 | 0 | -1000 | 0 | 0 |
| 23.03.2023 04:00 - 05:00 | 0 | -1000 | 0 | 0 |
| 23.03.2023 05:00 - 06:00 | 0 | -1000 | 0 | 0 |
| 23.03.2023 06:00 - 07:00 | 0 | 0 | 0 | 0 |
| 23.03.2023 07:00 - 08:00 | 0 | 0 | 0 | 0 |
| 23.03.2023 08:00 - 09:00 | 0 | 0 | 0 | 0 |
| 23.03.2023 09:00 - 10:00 | 0 | 0 | 0 | 0 |
| 23.03.2023 10:00 - 11:00 | 0 | 0 | 0 | 0 |
| 23.03.2023 11:00 - 12:00 | 0 | 0 | 0 | 0 |
| 23.03.2023 12:00 - 13:00 | 0 | 0 | 0 | 0 |
| 23.03.2023 13:00 - 14:00 | 0 | 0 | 0 | 0 |
| 23.03.2023 14:00 - 15:00 | 0 | 0 | 0 | 0 |
| 23.03.2023 15:00 - 16:00 | 0 | 0 | 0 | 0 |
| 23.03.2023 16:00 - 17:00 | 0 | 0 | 0 | 0 |
| 23.03.2023 17:00 - 18:00 | 0 | 0 | 0 | 0 |
| 23.03.2023 18:00 - 19:00 | 0 | 0 | 0 | 0 |
| 23.03.2023 19:00 - 20:00 | 0 | 0 | 0 | 0 |
| 23.03.2023 20:00 - 21:00 | 0 | 0 | 0 | 0 |
| 23.03.2023 21:00 - 22:00 | 0 | 0 | 0 | 0 |
| 23.03.2023 22:00 - 23:00 | 0 | 0 | 0 | 0 |
| 23.03.2023 23:00 - 24:00 | 0 | 0 | 0 | 0 |
| 24.03.2023 00:00 - 01:00 | 0 | 0 | 0 | 0 |
| 24.03.2023 01:00 - 02:00 | 0 | 0 | 0 | 0 |
| 24.03.2023 02:00 - 03:00 | 0 | 0 | 0 | 0 |
| 24.03.2023 03:00 - 04:00 | 0 | 0 | 0 | 0 |
| 24.03.2023 04:00 - 05:00 | 0 | 0 | 0 | 0 |
| 24.03.2023 05:00 - 06:00 | 0 | 0 | 0 | 0 |
| 24.03.2023 06:00 - 07:00 | 0 | 0 | 0 | 0 |
| 24.03.2023 07:00 - 08:00 | 0 | 0 | 0 | 0 |
| 24.03.2023 08:00 - 09:00 | 0 | 0 | 0 | 0 |
| 24.03.2023 09:00 - 10:00 | 0 | 0 | 0 | 0 |
| 24.03.2023 10:00 - 11:00 | 0 | 0 | 0 | 0 |
| 24.03.2023 11:00 - 12:00 | 0 | 0 | 0 | 0 |
| 24.03.2023 12:00 - 13:00 | 0 | 0 | 0 | 0 |
| 24.03.2023 13:00 - 14:00 | 0 | 0 | 0 | 0 |
| 24.03.2023 14:00 - 15:00 | 0 | 0 | 0 | 0 |
| 24.03.2023 15:00 - 16:00 | 0 | 0 | 0 | 0 |
| 24.03.2023 16:00 - 17:00 | 0 | 0 | 0 | 0 |
| 24.03.2023 17:00 - 18:00 | 0 | 0 | 0 | 0 |
| 24.03.2023 18:00 - 19:00 | 0 | 0 | 0 | 0 |
| 24.03.2023 19:00 - 20:00 | 0 | 0 | 0 | 0 |
| 24.03.2023 20:00 - 21:00 | 0 | 0 | 0 | 0 |
| 24.03.2023 21:00 - 22:00 | 0 | 0 | 0 | 0 |
| 24.03.2023 22:00 - 23:00 | 0 | -500 | 0 | 0 |
| 24.03.2023 23:00 - 24:00 | 0 | -500 | 0 | 0 |
| 25.03.2023 00:00 - 01:00 | 0 | -500 | 0 | 0 |
| 25.03.2023 01:00 - 02:00 | 0 | -500 | 0 | 0 |
| 25.03.2023 02:00 - 03:00 | 0 | -500 | 0 | 0 |
| 25.03.2023 03:00 - 04:00 | 0 | -500 | 0 | 0 |
| 25.03.2023 04:00 - 05:00 | 0 | -500 | 0 | 0 |
| 25.03.2023 05:00 - 06:00 | 0 | -500 | 0 | 0 |
| 25.03.2023 06:00 - 07:00 | 0 | 0 | 0 | 0 |
| 25.03.2023 07:00 - 08:00 | 0 | 0 | 0 | 0 |
| 25.03.2023 08:00 - 09:00 | 0 | 0 | 0 | 0 |
| 25.03.2023 09:00 - 10:00 | 0 | 0 | 0 | 0 |
| 25.03.2023 10:00 - 11:00 | 0 | 0 | 0 | 0 |
| 25.03.2023 11:00 - 12:00 | 0 | 0 | 0 | 0 |
| 25.03.2023 12:00 - 13:00 | 0 | 0 | 0 | 0 |
| 25.03.2023 13:00 - 14:00 | 0 | 0 | 0 | 0 |
| 25.03.2023 14:00 - 15:00 | 0 | 0 | 0 | 0 |
| 25.03.2023 15:00 - 16:00 | 0 | 0 | 0 | 0 |
| 25.03.2023 16:00 - 17:00 | 0 | 0 | 0 | 0 |
| 25.03.2023 17:00 - 18:00 | 0 | 0 | 0 | 0 |
| 25.03.2023 18:00 - 19:00 | 0 | 0 | 0 | 0 |
| 25.03.2023 19:00 - 20:00 | 0 | 0 | 0 | 0 |
| 25.03.2023 20:00 - 21:00 | 0 | 0 | 0 | 0 |
| 25.03.2023 21:00 - 22:00 | 0 | 0 | 0 | 0 |
| 25.03.2023 22:00 - 23:00 | 0 | 0 | 0 | 0 |
| 25.03.2023 23:00 - 24:00 | 0 | 0 | 0 | 0 |
| 26.03.2023 00:00 - 01:00 | 0 | 0 | 0 | 0 |
| 26.03.2023 01:00 - 03:00 | 0 | 0 | 0 | 0 |
| 26.03.2023 03:00 - 04:00 | 0 | 0 | 0 | 0 |
| 26.03.2023 04:00 - 05:00 | 0 | 0 | 0 | 0 |
| 26.03.2023 05:00 - 06:00 | 0 | 0 | 0 | 0 |
| 26.03.2023 06:00 - 07:00 | 0 | 0 | 0 | 0 |
| 26.03.2023 07:00 - 08:00 | 0 | 0 | 0 | 0 |
| 26.03.2023 08:00 - 09:00 | 0 | 0 | 0 | 0 |
| 26.03.2023 09:00 - 10:00 | 0 | 0 | 0 | 0 |
| 26.03.2023 10:00 - 11:00 | 0 | 0 | 0 | 0 |
| 26.03.2023 11:00 - 12:00 | 0 | 0 | 0 | 0 |
| 26.03.2023 12:00 - 13:00 | 0 | 0 | 0 | 0 |
| 26.03.2023 13:00 - 14:00 | 0 | 0 | 0 | 0 |
| 26.03.2023 14:00 - 15:00 | 0 | 0 | 0 | 0 |
| 26.03.2023 15:00 - 16:00 | 0 | 0 | 0 | 0 |
| 26.03.2023 16:00 - 17:00 | 0 | 0 | 0 | 0 |
| 26.03.2023 17:00 - 18:00 | 0 | 0 | 0 | 0 |
| 26.03.2023 18:00 - 19:00 | 0 | 0 | 0 | 0 |
| 26.03.2023 19:00 - 20:00 | 0 | 0 | 0 | 0 |
| 26.03.2023 20:00 - 21:00 | 0 | 0 | 0 | 0 |
| 26.03.2023 21:00 - 22:00 | 0 | 0 | 0 | 0 |
| 26.03.2023 22:00 - 23:00 | 0 | 0 | 0 | 0 |
| 26.03.2023 23:00 - 24:00 | 0 | 0 | 0 | 0 |
| 27.03.2023 00:00 - 01:00 | 0 | 0 | 0 | 0 |
| 27.03.2023 01:00 - 02:00 | 0 | 0 | 0 | 0 |
| 27.03.2023 02:00 - 03:00 | 0 | 0 | 0 | 0 |
| 27.03.2023 03:00 - 04:00 | 0 | 0 | 0 | 0 |
| 27.03.2023 04:00 - 05:00 | 0 | 0 | 0 | 0 |
| 27.03.2023 05:00 - 06:00 | 0 | 0 | 0 | 0 |
| 27.03.2023 06:00 - 07:00 | 0 | 0 | 0 | 0 |
| 27.03.2023 07:00 - 08:00 | 0 | 0 | 0 | 0 |
| 27.03.2023 08:00 - 09:00 | 0 | 0 | 0 | 0 |
| 27.03.2023 09:00 - 10:00 | 0 | 0 | 0 | 0 |
| 27.03.2023 10:00 - 11:00 | 0 | 0 | 0 | 0 |
| 27.03.2023 11:00 - 12:00 | 0 | 0 | 0 | 0 |
| 27.03.2023 12:00 - 13:00 | 0 | 0 | 0 | 0 |
| 27.03.2023 13:00 - 14:00 | 0 | 0 | 0 | 0 |
| 27.03.2023 14:00 - 15:00 | 0 | 0 | 0 | 0 |
| 27.03.2023 15:00 - 16:00 | 0 | 0 | 0 | 0 |
| 27.03.2023 16:00 - 17:00 | 0 | 0 | 0 | 0 |
| 27.03.2023 17:00 - 18:00 | 0 | 0 | 0 | 0 |
| 27.03.2023 18:00 - 19:00 | 0 | 0 | 0 | 0 |
| 27.03.2023 19:00 - 20:00 | 0 | 0 | 0 | 0 |
| 27.03.2023 20:00 - 21:00 | 0 | 0 | 0 | 0 |
| 27.03.2023 21:00 - 22:00 | 0 | 0 | 0 | 0 |
| 27.03.2023 22:00 - 23:00 | 0 | 0 | 0 | 0 |
| 27.03.2023 23:00 - 24:00 | 0 | 0 | 0 | 0 |
| 28.03.2023 00:00 - 01:00 | 0 | 0 | 0 | 0 |
| 28.03.2023 01:00 - 02:00 | 0 | 0 | 0 | 0 |
| 28.03.2023 02:00 - 03:00 | 0 | 0 | 0 | 0 |
| 28.03.2023 03:00 - 04:00 | 0 | 0 | 0 | 0 |
| 28.03.2023 04:00 - 05:00 | 0 | 0 | 0 | 0 |
| 28.03.2023 05:00 - 06:00 | 0 | 0 | 0 | 0 |
| 28.03.2023 06:00 - 07:00 | 0 | 0 | 0 | 0 |
| 28.03.2023 07:00 - 08:00 | 0 | 0 | 0 | 0 |
| 28.03.2023 08:00 - 09:00 | 0 | 0 | 0 | 0 |
| 28.03.2023 09:00 - 10:00 | 0 | 0 | 0 | 0 |
| 28.03.2023 10:00 - 11:00 | 0 | 0 | 0 | 0 |
| 28.03.2023 11:00 - 12:00 | 0 | 0 | 0 | 0 |
| 28.03.2023 12:00 - 13:00 | 0 | 0 | 0 | 0 |
| 28.03.2023 13:00 - 14:00 | 0 | 0 | 0 | 0 |
| 28.03.2023 14:00 - 15:00 | 0 | 0 | 0 | 0 |
| 28.03.2023 15:00 - 16:00 | 0 | 0 | 0 | 0 |
| 28.03.2023 16:00 - 17:00 | 0 | 0 | 0 | 0 |
| 28.03.2023 17:00 - 18:00 | 0 | 0 | 0 | 0 |
| 28.03.2023 18:00 - 19:00 | 0 | 0 | 0 | 0 |
| 28.03.2023 19:00 - 20:00 | 0 | 0 | 0 | 0 |
| 28.03.2023 20:00 - 21:00 | 0 | 0 | 0 | 0 |
| 28.03.2023 21:00 - 22:00 | 0 | 0 | 0 | 0 |
| 28.03.2023 22:00 - 23:00 | 0 | 0 | 0 | 0 |
| 28.03.2023 23:00 - 24:00 | 0 | 0 | 0 | 0 |
| 29.03.2023 00:00 - 01:00 | 0 | 0 | 0 | 0 |
| 29.03.2023 01:00 - 02:00 | 0 | 0 | 0 | 0 |
| 29.03.2023 02:00 - 03:00 | 0 | 0 | 0 | 0 |
| 29.03.2023 03:00 - 04:00 | 0 | 0 | 0 | 0 |
| 29.03.2023 04:00 - 05:00 | 0 | 0 | 0 | 0 |
| 29.03.2023 05:00 - 06:00 | 0 | 0 | 0 | 0 |
| 29.03.2023 06:00 - 07:00 | 0 | 0 | 0 | 0 |
| 29.03.2023 07:00 - 08:00 | 0 | 0 | 0 | 0 |
| 29.03.2023 08:00 - 09:00 | 0 | 0 | 0 | 0 |
| 29.03.2023 09:00 - 10:00 | 0 | 0 | 0 | 0 |
| 29.03.2023 10:00 - 11:00 | 0 | 0 | 0 | 0 |
| 29.03.2023 11:00 - 12:00 | 0 | 0 | 0 | 0 |
| 29.03.2023 12:00 - 13:00 | 0 | 0 | 0 | 0 |
| 29.03.2023 13:00 - 14:00 | 0 | 0 | 0 | 0 |
| 29.03.2023 14:00 - 15:00 | 0 | 0 | 0 | 0 |
| 29.03.2023 15:00 - 16:00 | 0 | 0 | 0 | 0 |
| 29.03.2023 16:00 - 17:00 | 0 | 0 | 0 | 0 |
| 29.03.2023 17:00 - 18:00 | 0 | 0 | 0 | 0 |
| 29.03.2023 18:00 - 19:00 | 0 | 0 | 0 | 0 |
| 29.03.2023 19:00 - 20:00 | 0 | 0 | 0 | 0 |
| 29.03.2023 20:00 - 21:00 | 0 | 0 | 0 | 0 |
| 29.03.2023 21:00 - 22:00 | 0 | 0 | 0 | 0 |
| 29.03.2023 22:00 - 23:00 | 0 | 0 | 0 | 0 |
| 29.03.2023 23:00 - 24:00 | 0 | 0 | 0 | 0 |
| 30.03.2023 00:00 - 01:00 | 0 | 0 | 0 | 0 |
| 30.03.2023 01:00 - 02:00 | 0 | 0 | 0 | 0 |
| 30.03.2023 02:00 - 03:00 | 0 | 0 | 0 | 0 |
| 30.03.2023 03:00 - 04:00 | 0 | 0 | 0 | 0 |
| 30.03.2023 04:00 - 05:00 | 0 | 0 | 0 | 0 |
| 30.03.2023 05:00 - 06:00 | 0 | 0 | 0 | 0 |
| 30.03.2023 06:00 - 07:00 | 0 | 0 | 0 | 0 |
| 30.03.2023 07:00 - 08:00 | 0 | 0 | 0 | 0 |
| 30.03.2023 08:00 - 09:00 | 0 | 0 | 0 | 0 |
| 30.03.2023 09:00 - 10:00 | 0 | 0 | 0 | 0 |
| 30.03.2023 10:00 - 11:00 | 0 | 0 | 0 | 0 |
| 30.03.2023 11:00 - 12:00 | 0 | 0 | 0 | 0 |
| 30.03.2023 12:00 - 13:00 | 0 | 0 | 0 | 0 |
| 30.03.2023 13:00 - 14:00 | 0 | 0 | 0 | 0 |
| 30.03.2023 14:00 - 15:00 | 0 | 0 | 0 | 0 |
| 30.03.2023 15:00 - 16:00 | 0 | 0 | 0 | 0 |
| 30.03.2023 16:00 - 17:00 | 600 | 0 | 0 | 0 |
| 30.03.2023 17:00 - 18:00 | 600 | 0 | 0 | 0 |
| 30.03.2023 18:00 - 19:00 | 600 | 0 | 0 | 0 |
| 30.03.2023 19:00 - 20:00 | 600 | 0 | 0 | 0 |
| 30.03.2023 20:00 - 21:00 | 600 | 0 | 0 | 0 |
| 30.03.2023 21:00 - 22:00 | 600 | 0 | 0 | 0 |
| 30.03.2023 22:00 - 23:00 | 600 | 0 | 0 | 0 |
| 30.03.2023 23:00 - 24:00 | 600 | 0 | 0 | 0 |
| 31.03.2023 00:00 - 01:00 | 600 | 0 | 0 | 0 |
| 31.03.2023 01:00 - 02:00 | 600 | 0 | 0 | 0 |
| 31.03.2023 02:00 - 03:00 | 600 | 0 | 0 | 0 |
| 31.03.2023 03:00 - 04:00 | 600 | 0 | 0 | 0 |
| 31.03.2023 04:00 - 05:00 | 600 | 0 | 0 | 0 |
| 31.03.2023 05:00 - 06:00 | 600 | 0 | 0 | 0 |